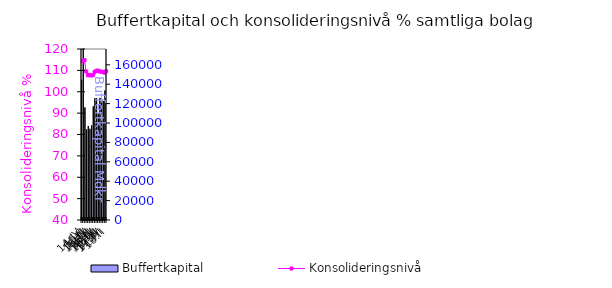
| Category | Buffertkapital |
|---|---|
| 14:IV | 144388 |
| 15:I | 176275 |
| 15:II | 115986 |
| 15:III | 93256 |
| 15:IV | 96751 |
| 16:I | 93969 |
| 16:II | 97361 |
| 16:III | 117165 |
| 16:IV | 125572 |
| 17:I | 125581 |
| 17:II | 109536 |
| 17:III | 125833 |
| 17:IV | 125322 |
| 18:I | 122581 |
| 18:II | 133410 |